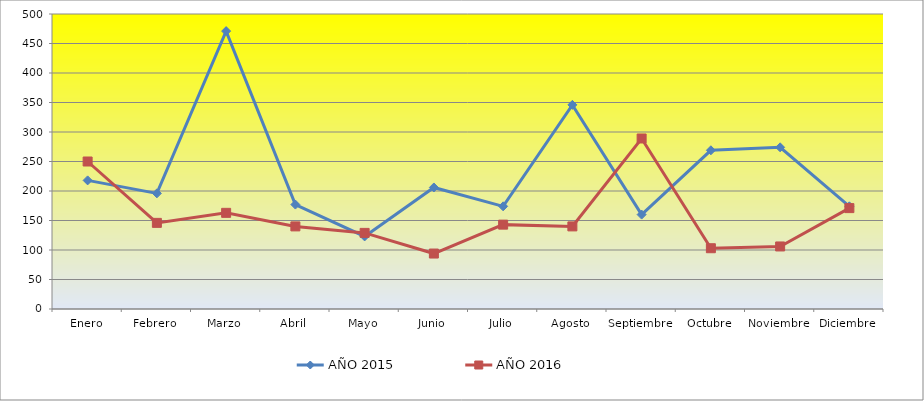
| Category | AÑO 2015 | AÑO 2016 |
|---|---|---|
| Enero | 218 | 250 |
| Febrero | 196 | 146 |
| Marzo | 471 | 163 |
| Abril | 177 | 140 |
| Mayo | 123 | 129 |
| Junio | 206 | 94 |
| Julio | 174 | 143 |
| Agosto | 346 | 140 |
| Septiembre | 160 | 289 |
| Octubre | 269 | 103 |
| Noviembre | 274 | 106 |
| Diciembre | 174 | 171 |